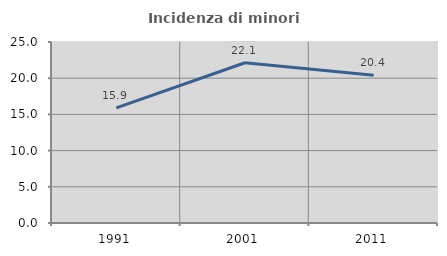
| Category | Incidenza di minori stranieri |
|---|---|
| 1991.0 | 15.909 |
| 2001.0 | 22.131 |
| 2011.0 | 20.395 |